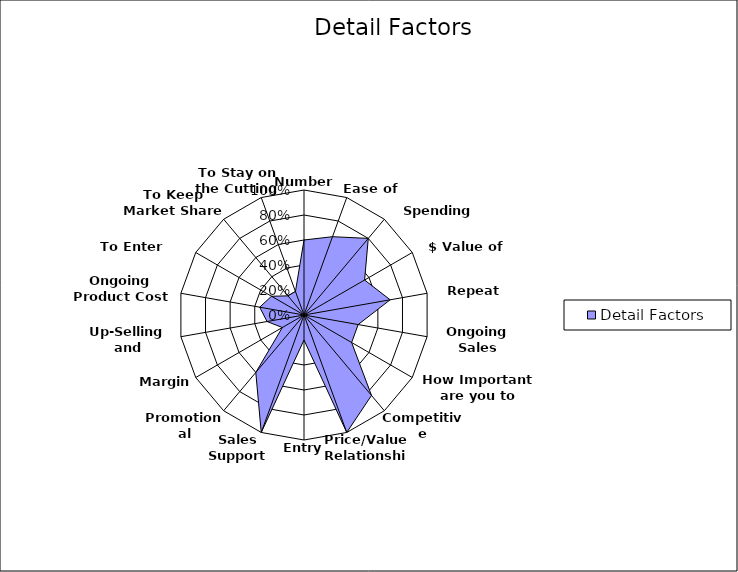
| Category | Detail Factors |
|---|---|
| Number | 0.6 |
| Ease of Finding | 0.667 |
| Spending Pattern | 0.8 |
| $ Value of Sale | 0.56 |
| Repeat Sales | 0.7 |
| Ongoing Sales Support | 0.44 |
| How Important are you to Customer | 0.44 |
| Competitive Advantage | 0.84 |
| Price/Value Relationship | 1 |
| Entry Points | 0.2 |
| Sales Support Required | 1 |
| Promotional Activities | 0.6 |
| Margins | 0.2 |
| Up-Selling and Cross-Selling  | 0.3 |
| Ongoing Product Cost | 0.36 |
| To Enter Business | 0.3 |
| To Keep Market Share | 0.2 |
| To Stay on the Cutting Edge | 0.2 |